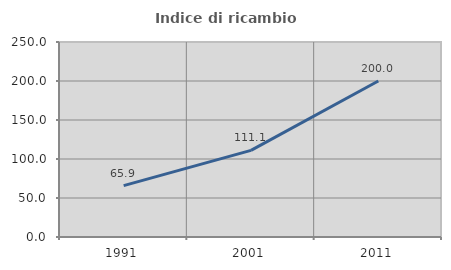
| Category | Indice di ricambio occupazionale  |
|---|---|
| 1991.0 | 65.909 |
| 2001.0 | 111.111 |
| 2011.0 | 200 |